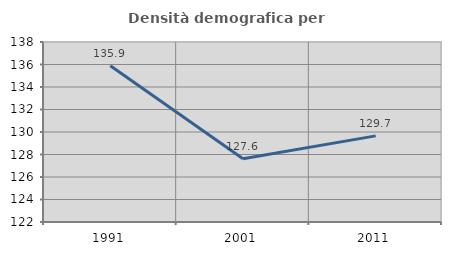
| Category | Densità demografica |
|---|---|
| 1991.0 | 135.888 |
| 2001.0 | 127.624 |
| 2011.0 | 129.657 |